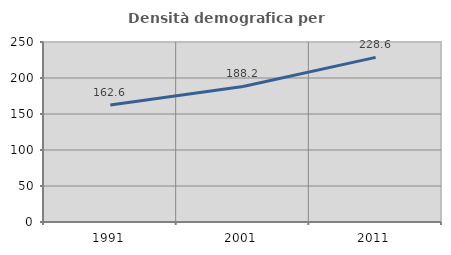
| Category | Densità demografica |
|---|---|
| 1991.0 | 162.635 |
| 2001.0 | 188.207 |
| 2011.0 | 228.644 |